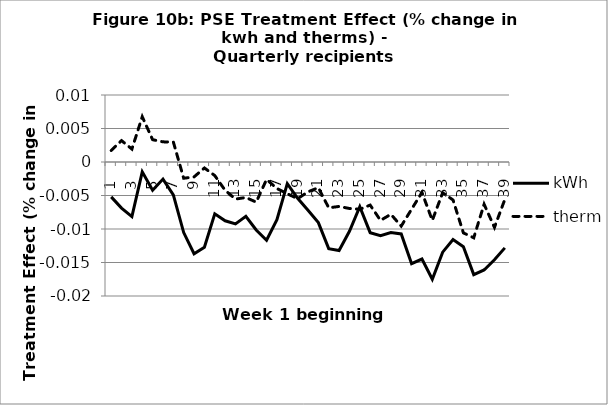
| Category | kWh | therms |
|---|---|---|
| 1.0 | -0.005 | 0.002 |
| 2.0 | -0.007 | 0.003 |
| 3.0 | -0.008 | 0.002 |
| 4.0 | -0.001 | 0.007 |
| 5.0 | -0.004 | 0.003 |
| 6.0 | -0.003 | 0.003 |
| 7.0 | -0.005 | 0.003 |
| 8.0 | -0.011 | -0.002 |
| 9.0 | -0.014 | -0.002 |
| 10.0 | -0.013 | -0.001 |
| 11.0 | -0.008 | -0.002 |
| 12.0 | -0.009 | -0.004 |
| 13.0 | -0.009 | -0.006 |
| 14.0 | -0.008 | -0.005 |
| 15.0 | -0.01 | -0.006 |
| 16.0 | -0.012 | -0.003 |
| 17.0 | -0.009 | -0.004 |
| 18.0 | -0.003 | -0.005 |
| 19.0 | -0.005 | -0.005 |
| 20.0 | -0.007 | -0.004 |
| 21.0 | -0.009 | -0.004 |
| 22.0 | -0.013 | -0.007 |
| 23.0 | -0.013 | -0.007 |
| 24.0 | -0.01 | -0.007 |
| 25.0 | -0.007 | -0.007 |
| 26.0 | -0.011 | -0.006 |
| 27.0 | -0.011 | -0.009 |
| 28.0 | -0.011 | -0.008 |
| 29.0 | -0.011 | -0.01 |
| 30.0 | -0.015 | -0.007 |
| 31.0 | -0.014 | -0.005 |
| 32.0 | -0.017 | -0.009 |
| 33.0 | -0.013 | -0.005 |
| 34.0 | -0.012 | -0.006 |
| 35.0 | -0.013 | -0.011 |
| 36.0 | -0.017 | -0.011 |
| 37.0 | -0.016 | -0.006 |
| 38.0 | -0.015 | -0.01 |
| 39.0 | -0.013 | -0.006 |